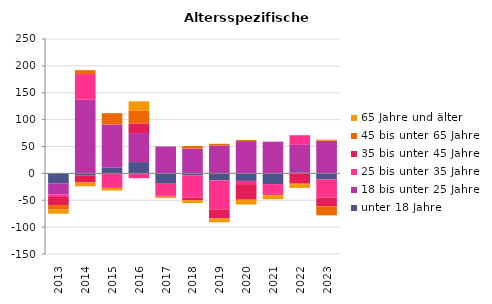
| Category | unter 18 Jahre | 18 bis unter 25 Jahre | 25 bis unter 35 Jahre | 35 bis unter 45 Jahre | 45 bis unter 65 Jahre | 65 Jahre und älter |
|---|---|---|---|---|---|---|
| 2013.0 | -19 | -20 | -5 | -15 | -8 | -8 |
| 2014.0 | -4 | 137 | 48 | -13 | 7 | -7 |
| 2015.0 | 11 | 80 | -27 | 0 | 21 | -5 |
| 2016.0 | 21 | 54 | -9 | 18 | 24 | 17 |
| 2017.0 | -18 | 50 | -23 | -2 | -2 | -1 |
| 2018.0 | -4 | 46 | -41 | -5 | 5 | -5 |
| 2019.0 | -13 | 52 | -54 | -17 | 3 | -7 |
| 2020.0 | -14 | 60 | -6 | -29 | 2 | -9 |
| 2021.0 | -20 | 59 | -18 | -2 | -1 | -7 |
| 2022.0 | 1 | 52 | 18 | -19 | -1 | -7 |
| 2023.0 | -11 | 61 | -34 | -16 | -17 | 2 |